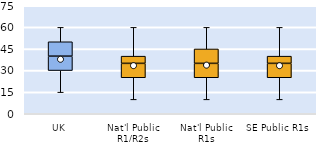
| Category | 25th | 50th | 75th |
|---|---|---|---|
| UK | 30 | 10 | 10 |
| Nat'l Public R1/R2s | 25 | 10 | 5 |
| Nat'l Public R1s | 25 | 10 | 10 |
| SE Public R1s | 25 | 10 | 5 |